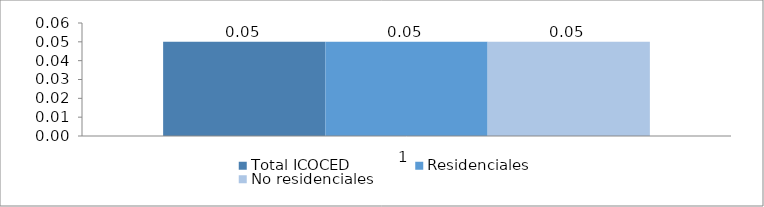
| Category | Total ICOCED | Residenciales | No residenciales |
|---|---|---|---|
| 0 | 0.05 | 0.05 | 0.05 |